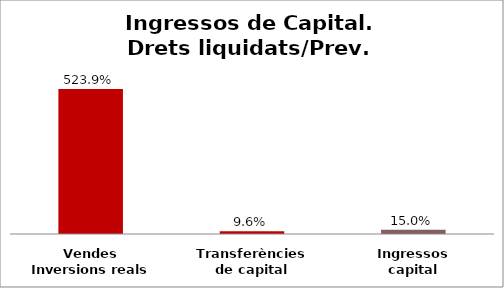
| Category | Series 0 |
|---|---|
| Vendes Inversions reals | 5.239 |
| Transferències de capital | 0.096 |
| Ingressos capital | 0.15 |